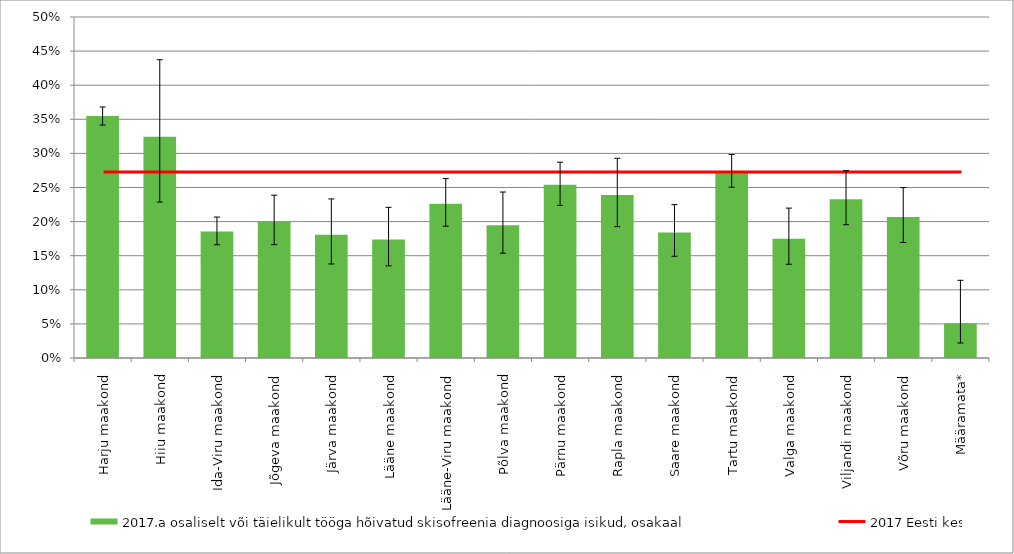
| Category | 2017.a osaliselt või täielikult tööga hõivatud skisofreenia diagnoosiga isikud, osakaal |
|---|---|
| Harju maakond | 0.355 |
| Hiiu maakond | 0.324 |
| Ida-Viru maakond | 0.186 |
| Jõgeva maakond | 0.2 |
| Järva maakond | 0.181 |
| Lääne maakond | 0.174 |
| Lääne-Viru maakond | 0.226 |
| Põlva maakond | 0.195 |
| Pärnu maakond | 0.254 |
| Rapla maakond | 0.239 |
| Saare maakond | 0.184 |
| Tartu maakond | 0.274 |
| Valga maakond | 0.175 |
| Viljandi maakond | 0.233 |
| Võru maakond | 0.207 |
| Määramata* | 0.051 |